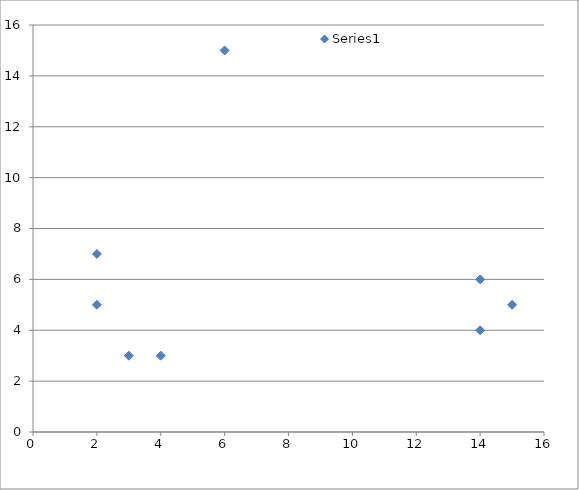
| Category | Series 0 |
|---|---|
| 2.0 | 7 |
| 2.0 | 5 |
| 4.0 | 3 |
| 6.0 | 15 |
| 14.0 | 6 |
| 14.0 | 4 |
| 15.0 | 5 |
| 3.0 | 3 |